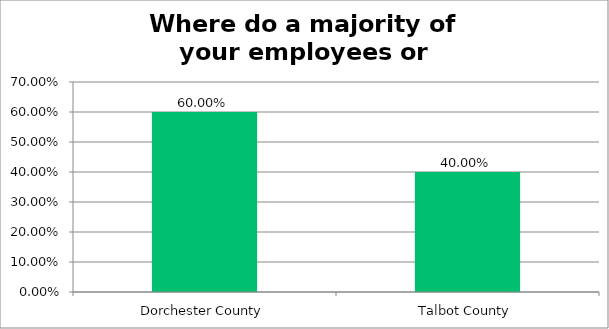
| Category | Responses |
|---|---|
| Dorchester County | 0.6 |
| Talbot County | 0.4 |